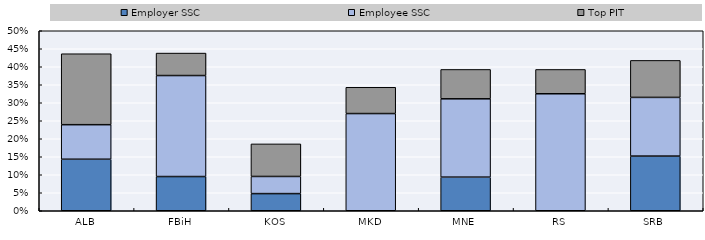
| Category | Employer SSC | Employee SSC | Top PIT |
|---|---|---|---|
| ALB | 0.143 | 0.096 | 0.197 |
| FBiH | 0.095 | 0.281 | 0.062 |
| KOS | 0.048 | 0.048 | 0.09 |
| MKD | 0 | 0.27 | 0.073 |
| MNE | 0.093 | 0.218 | 0.082 |
| RS | 0 | 0.325 | 0.068 |
| SRB | 0.152 | 0.163 | 0.103 |